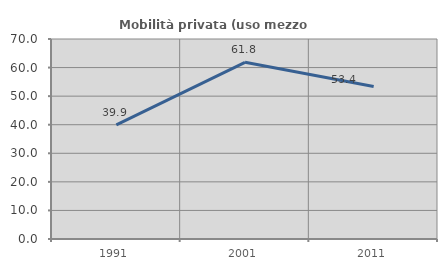
| Category | Mobilità privata (uso mezzo privato) |
|---|---|
| 1991.0 | 39.931 |
| 2001.0 | 61.847 |
| 2011.0 | 53.403 |